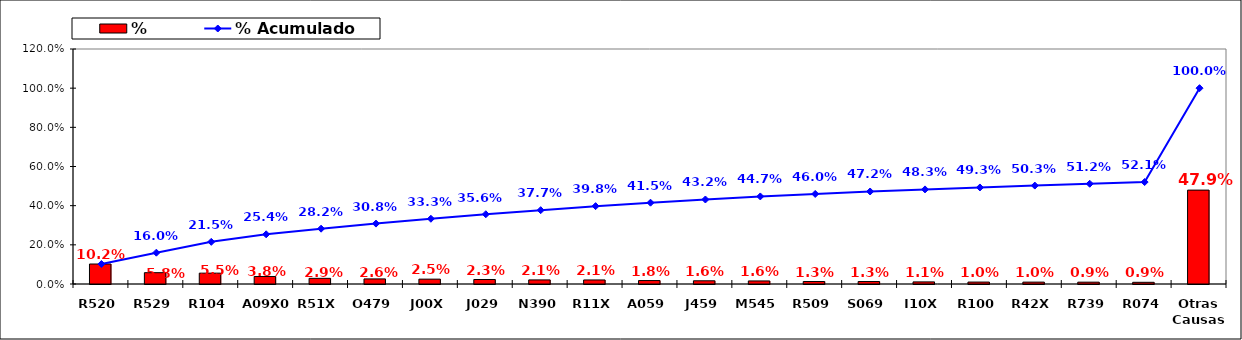
| Category | % |
|---|---|
| R520 | 0.102 |
| R529 | 0.058 |
| R104 | 0.055 |
| A09X0 | 0.038 |
| R51X | 0.029 |
| O479 | 0.026 |
| J00X | 0.025 |
| J029 | 0.023 |
| N390 | 0.021 |
| R11X | 0.021 |
| A059 | 0.018 |
| J459 | 0.016 |
| M545 | 0.016 |
| R509 | 0.013 |
| S069 | 0.013 |
| I10X | 0.011 |
| R100 | 0.01 |
| R42X | 0.01 |
| R739 | 0.009 |
| R074 | 0.009 |
| Otras Causas | 0.479 |